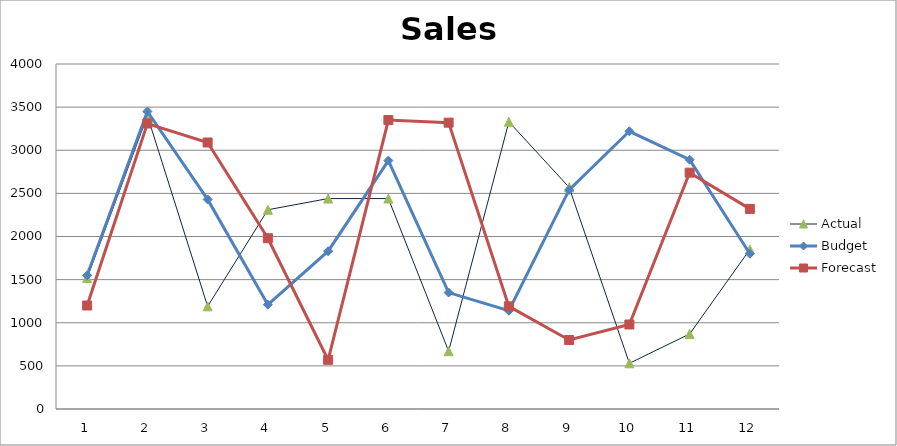
| Category | Actual | Budget | Forecast |
|---|---|---|---|
| 0 | 1520 | 1550 | 1200 |
| 1 | 3400 | 3450 | 3310 |
| 2 | 1190 | 2430 | 3090 |
| 3 | 2310 | 1210 | 1980 |
| 4 | 2440 | 1830 | 570 |
| 5 | 2440 | 2880 | 3350 |
| 6 | 670 | 1350 | 3320 |
| 7 | 3330 | 1140 | 1190 |
| 8 | 2570 | 2540 | 800 |
| 9 | 530 | 3220 | 980 |
| 10 | 870 | 2890 | 2740 |
| 11 | 1850 | 1800 | 2320 |